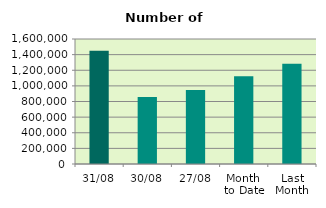
| Category | Series 0 |
|---|---|
| 31/08 | 1449962 |
| 30/08 | 857272 |
| 27/08 | 947570 |
| Month 
to Date | 1124493.364 |
| Last
Month | 1281605.545 |